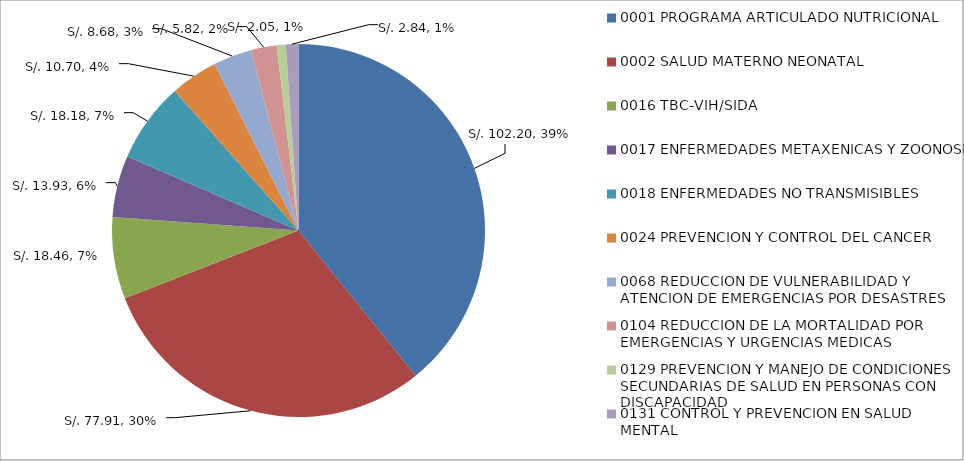
| Category | Series 0 |
|---|---|
| 0001 PROGRAMA ARTICULADO NUTRICIONAL | 102.205 |
| 0002 SALUD MATERNO NEONATAL | 77.906 |
| 0016 TBC-VIH/SIDA | 18.456 |
| 0017 ENFERMEDADES METAXENICAS Y ZOONOSIS | 13.932 |
| 0018 ENFERMEDADES NO TRANSMISIBLES | 18.179 |
| 0024 PREVENCION Y CONTROL DEL CANCER | 10.701 |
| 0068 REDUCCION DE VULNERABILIDAD Y ATENCION DE EMERGENCIAS POR DESASTRES | 8.678 |
| 0104 REDUCCION DE LA MORTALIDAD POR EMERGENCIAS Y URGENCIAS MEDICAS | 5.817 |
| 0129 PREVENCION Y MANEJO DE CONDICIONES SECUNDARIAS DE SALUD EN PERSONAS CON DISCAPACIDAD | 2.05 |
| 0131 CONTROL Y PREVENCION EN SALUD MENTAL | 2.835 |